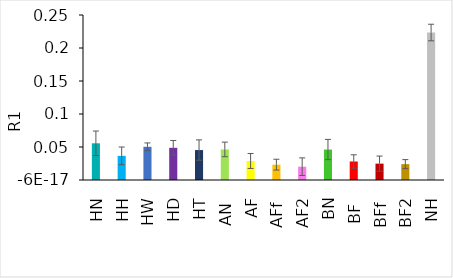
| Category | Average R1 |
|---|---|
| HN | 0.056 |
| HH | 0.037 |
| HW | 0.05 |
| HD | 0.049 |
| HT | 0.045 |
| AN  | 0.046 |
| AF | 0.029 |
| AFf  | 0.023 |
| AF2 | 0.02 |
| BN | 0.046 |
| BF  | 0.028 |
| BFf  | 0.025 |
| BF2 | 0.024 |
| NH | 0.223 |